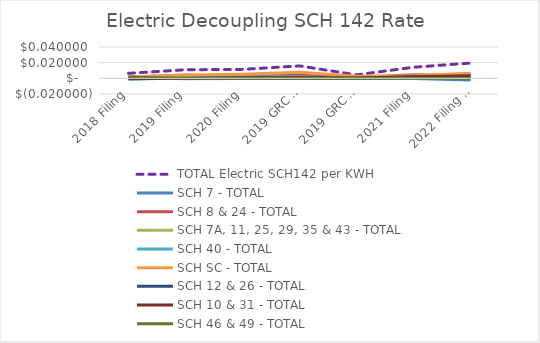
| Category | TOTAL Electric SCH142 per KWH | SCH 7 - TOTAL | SCH 8 & 24 - TOTAL | SCH 7A, 11, 25, 29, 35 & 43 - TOTAL | SCH 40 - TOTAL | SCH SC - TOTAL | SCH 12 & 26 - TOTAL | SCH 10 & 31 - TOTAL | SCH 46 & 49 - TOTAL |
|---|---|---|---|---|---|---|---|---|---|
| 2018 Filing | 0.006 | -0.001 | 0.001 | 0.001 | 0.002 | 0.002 | 0 | 0 | 0.001 |
| 2019 Filing | 0.011 | 0.001 | 0.003 | -0.001 | 0.004 | 0.004 | 0 | 0 | 0 |
| 2020 Filing | 0.011 | 0.001 | 0.003 | 0 | 0.002 | 0.005 | 0 | 0.001 | 0 |
| 2019 GRC Filing | 0.016 | 0.001 | 0.004 | 0 | 0.002 | 0.008 | 0 | 0.001 | 0 |
| 2019 GRC Correction Filing | 0.004 | 0 | 0.001 | 0 | 0 | 0.003 | 0 | 0 | 0 |
| 2021 Filing | 0.014 | 0 | 0.004 | 0.003 | 0 | 0.003 | 0.002 | 0.002 | 0 |
| 2022 Filing *** | 0.02 | -0.002 | 0.004 | 0.006 | 0 | 0.006 | 0.003 | 0.003 | 0 |